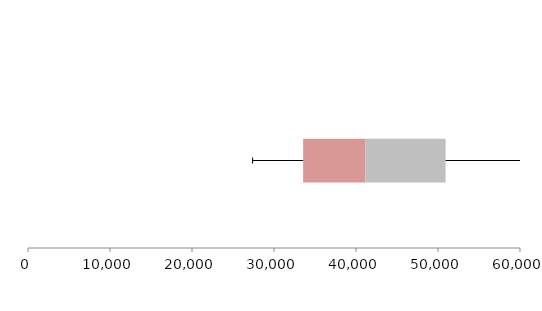
| Category | Series 1 | Series 2 | Series 3 |
|---|---|---|---|
| 0 | 33554.02 | 7596.373 | 9774.413 |